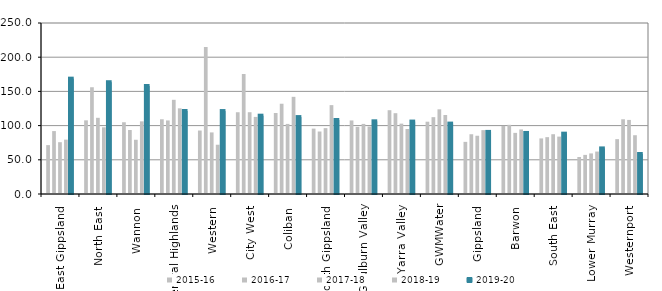
| Category | 2015-16 | 2016-17 | 2017-18 | 2018-19 | 2019-20 |
|---|---|---|---|---|---|
| East Gippsland  | 71.477 | 91.991 | 75.727 | 79.472 | 168.629 |
| North East  | 107.697 | 156.075 | 111.384 | 97.508 | 163.427 |
| Wannon  | 104.896 | 93.541 | 79.278 | 106.216 | 157.869 |
| Central Highlands  | 109.246 | 107.553 | 137.691 | 125.241 | 121.356 |
| Western  | 92.791 | 214.821 | 90.038 | 72.028 | 121.262 |
| City West  | 119.535 | 175.434 | 119.561 | 112.712 | 114.492 |
| Coliban  | 118.425 | 131.963 | 102.459 | 142.052 | 112.454 |
| South Gippsland  | 95.593 | 91.365 | 96.285 | 129.92 | 108.171 |
| Goulburn Valley  | 107.542 | 98.158 | 102.461 | 98.602 | 106.264 |
| Yarra Valley  | 122.497 | 118.151 | 102.872 | 94.999 | 105.885 |
| GWMWater | 105.707 | 112.337 | 123.791 | 115.491 | 102.923 |
| Gippsland  | 76.235 | 87.375 | 85.156 | 93.37 | 90.767 |
| Barwon  | 99.549 | 101.106 | 89.37 | 94.37 | 89.232 |
| South East  | 81.269 | 83.122 | 87.417 | 83.916 | 88.209 |
| Lower Murray  | 54.131 | 57.177 | 59.333 | 62.038 | 66.647 |
| Westernport  | 80.191 | 109.257 | 108.29 | 85.934 | 58.441 |